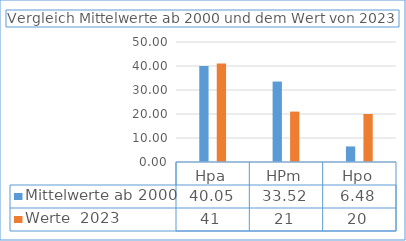
| Category | Mittelwerte ab 2000 | Werte  2023 |
|---|---|---|
| Hpa | 40.05 | 41 |
| HPm | 33.52 | 21 |
| Hpo | 6.48 | 20 |